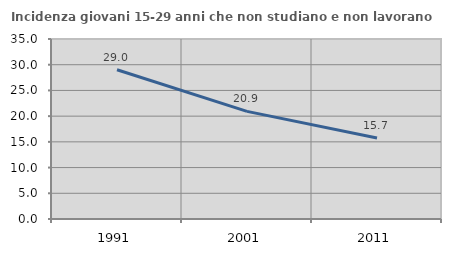
| Category | Incidenza giovani 15-29 anni che non studiano e non lavorano  |
|---|---|
| 1991.0 | 29.012 |
| 2001.0 | 20.932 |
| 2011.0 | 15.747 |